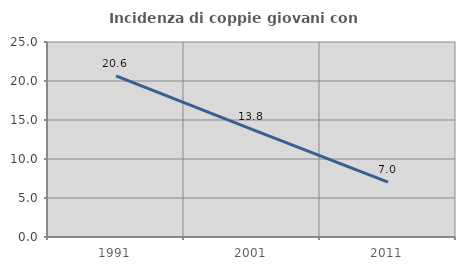
| Category | Incidenza di coppie giovani con figli |
|---|---|
| 1991.0 | 20.65 |
| 2001.0 | 13.805 |
| 2011.0 | 7.035 |